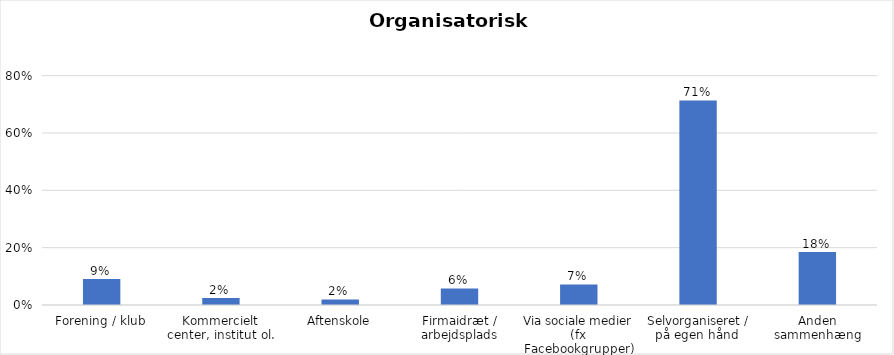
| Category | % |
|---|---|
| Forening / klub | 0.091 |
| Kommercielt center, institut ol. | 0.025 |
| Aftenskole | 0.019 |
| Firmaidræt / arbejdsplads | 0.058 |
| Via sociale medier (fx Facebookgrupper) | 0.072 |
| Selvorganiseret / på egen hånd  | 0.713 |
| Anden sammenhæng | 0.185 |